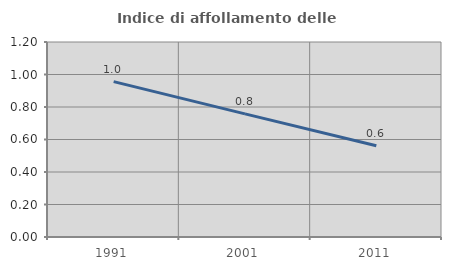
| Category | Indice di affollamento delle abitazioni  |
|---|---|
| 1991.0 | 0.956 |
| 2001.0 | 0.758 |
| 2011.0 | 0.562 |